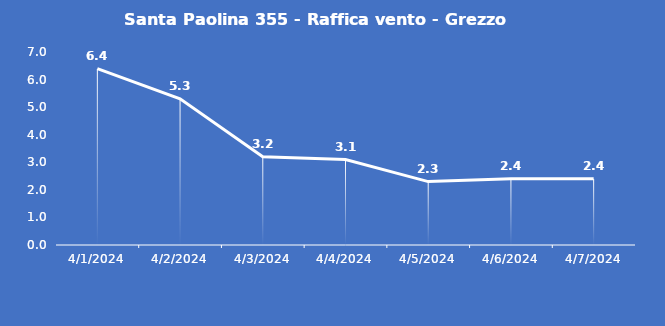
| Category | Santa Paolina 355 - Raffica vento - Grezzo (m/s) |
|---|---|
| 4/1/24 | 6.4 |
| 4/2/24 | 5.3 |
| 4/3/24 | 3.2 |
| 4/4/24 | 3.1 |
| 4/5/24 | 2.3 |
| 4/6/24 | 2.4 |
| 4/7/24 | 2.4 |